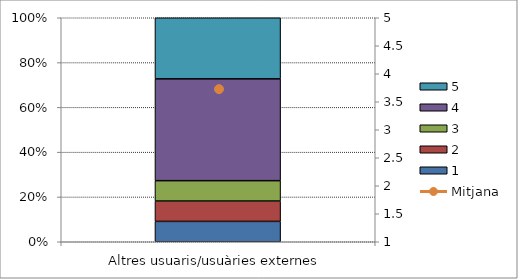
| Category | 1 | 2 | 3 | 4 | 5 |
|---|---|---|---|---|---|
| Altres usuaris/usuàries externes | 1 | 1 | 1 | 5 | 3 |